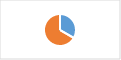
| Category | Section 2.G : Moyens humains, matériels et/ou financiers alloués à la LAV |
|---|---|
| 0 | 0.333 |
| 1 | 0.667 |